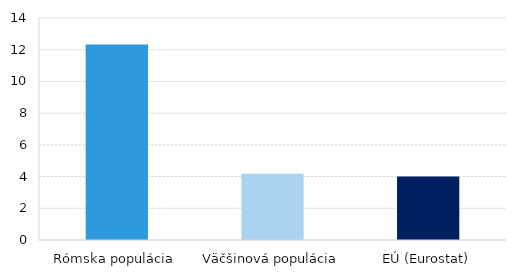
| Category | Series 0 |
|---|---|
| Rómska populácia | 12.332 |
| Väčšinová populácia | 4.179 |
| EÚ (Eurostat) | 4.01 |